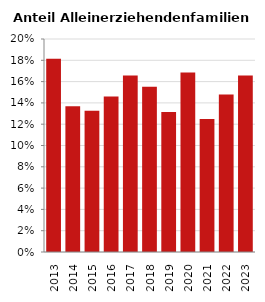
| Category | Anteil Alleinerziehende an Familien |
|---|---|
| 2013.0 | 0.181 |
| 2014.0 | 0.137 |
| 2015.0 | 0.133 |
| 2016.0 | 0.146 |
| 2017.0 | 0.166 |
| 2018.0 | 0.155 |
| 2019.0 | 0.131 |
| 2020.0 | 0.169 |
| 2021.0 | 0.125 |
| 2022.0 | 0.148 |
| 2023.0 | 0.166 |